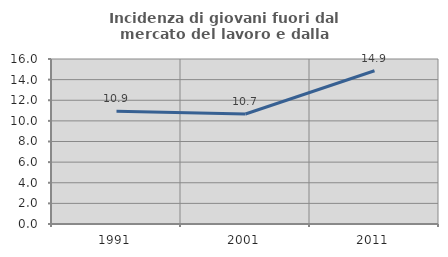
| Category | Incidenza di giovani fuori dal mercato del lavoro e dalla formazione  |
|---|---|
| 1991.0 | 10.924 |
| 2001.0 | 10.667 |
| 2011.0 | 14.865 |